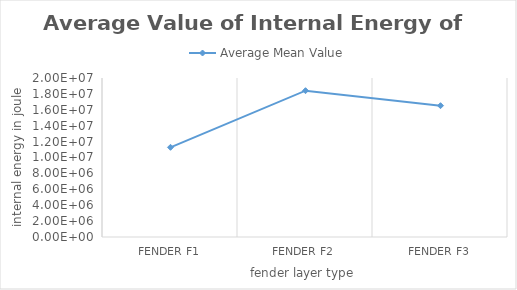
| Category | Average Mean Value |
|---|---|
| Fender F1 | 11282770 |
| Fender F2 | 18402240 |
| Fender F3 | 16515660 |